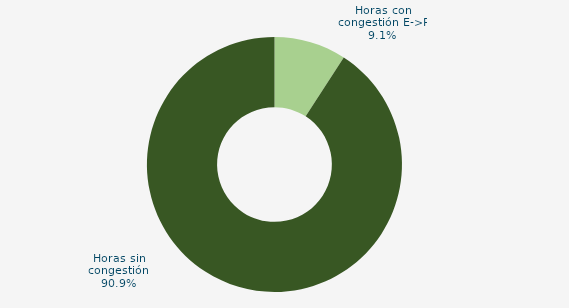
| Category | Horas con congestión E->P |
|---|---|
| Horas con congestión E->P | 9.14 |
| Horas con congestión P->E | 0 |
| Horas sin congestión | 90.86 |